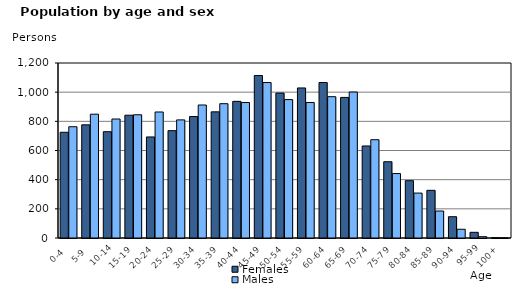
| Category | Females | Males |
|---|---|---|
|   0-4  | 725 | 763 |
|   5-9  | 776 | 849 |
| 10-14 | 729 | 816 |
| 15-19  | 842 | 845 |
| 20-24  | 693 | 864 |
| 25-29  | 736 | 810 |
| 30-34  | 833 | 912 |
| 35-39  | 865 | 921 |
| 40-44  | 937 | 929 |
| 45-49  | 1114 | 1066 |
| 50-54  | 994 | 949 |
| 55-59  | 1029 | 929 |
| 60-64  | 1066 | 969 |
| 65-69  | 964 | 1001 |
| 70-74  | 631 | 674 |
| 75-79  | 523 | 442 |
| 80-84  | 393 | 308 |
| 85-89  | 327 | 185 |
| 90-94  | 146 | 60 |
| 95-99 | 39 | 9 |
| 100+ | 2 | 1 |